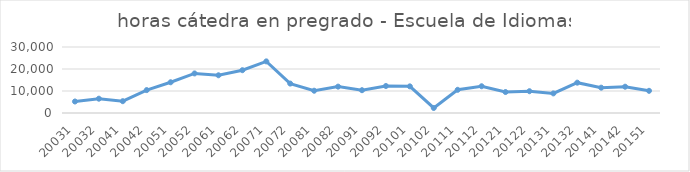
| Category | Total horas |
|---|---|
| 20031 | 5228 |
| 20032 | 6504 |
| 20041 | 5369 |
| 20042 | 10414 |
| 20051 | 13968 |
| 20052 | 17985 |
| 20061 | 17146 |
| 20062 | 19456 |
| 20071 | 23467 |
| 20072 | 13374 |
| 20081 | 10122 |
| 20082 | 11986 |
| 20091 | 10363 |
| 20092 | 12269 |
| 20101 | 12110 |
| 20102 | 2280 |
| 20111 | 10545 |
| 20112 | 12162 |
| 20121 | 9537 |
| 20122 | 9904 |
| 20131 | 8911 |
| 20132 | 13792 |
| 20141 | 11506 |
| 20142 | 11952 |
| 20151 | 10083 |